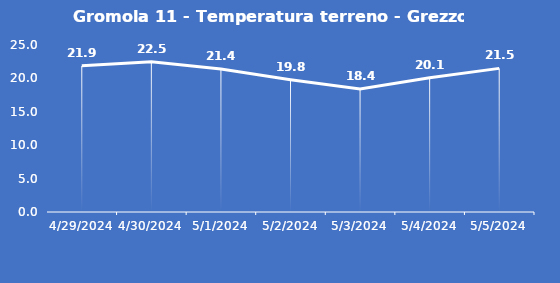
| Category | Gromola 11 - Temperatura terreno - Grezzo (°C) |
|---|---|
| 4/29/24 | 21.9 |
| 4/30/24 | 22.5 |
| 5/1/24 | 21.4 |
| 5/2/24 | 19.8 |
| 5/3/24 | 18.4 |
| 5/4/24 | 20.1 |
| 5/5/24 | 21.5 |